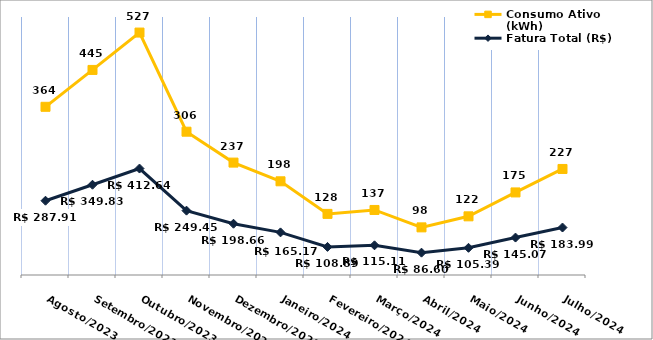
| Category | Fatura Total (R$) | Consumo Ativo (kWh) |
|---|---|---|
| Agosto/2023 | 287.91 | 364 |
| Setembro/2023 | 349.83 | 445 |
| Outubro/2023 | 412.64 | 527 |
| Novembro/2023 | 249.45 | 306 |
| Dezembro/2023 | 198.66 | 237 |
| Janeiro/2024 | 165.17 | 198 |
| Fevereiro/2024 | 108.89 | 128 |
| Março/2024 | 115.11 | 137 |
| Abril/2024 | 86.6 | 98 |
| Maio/2024 | 105.39 | 122 |
| Junho/2024 | 145.07 | 175 |
| Julho/2024 | 183.99 | 227 |